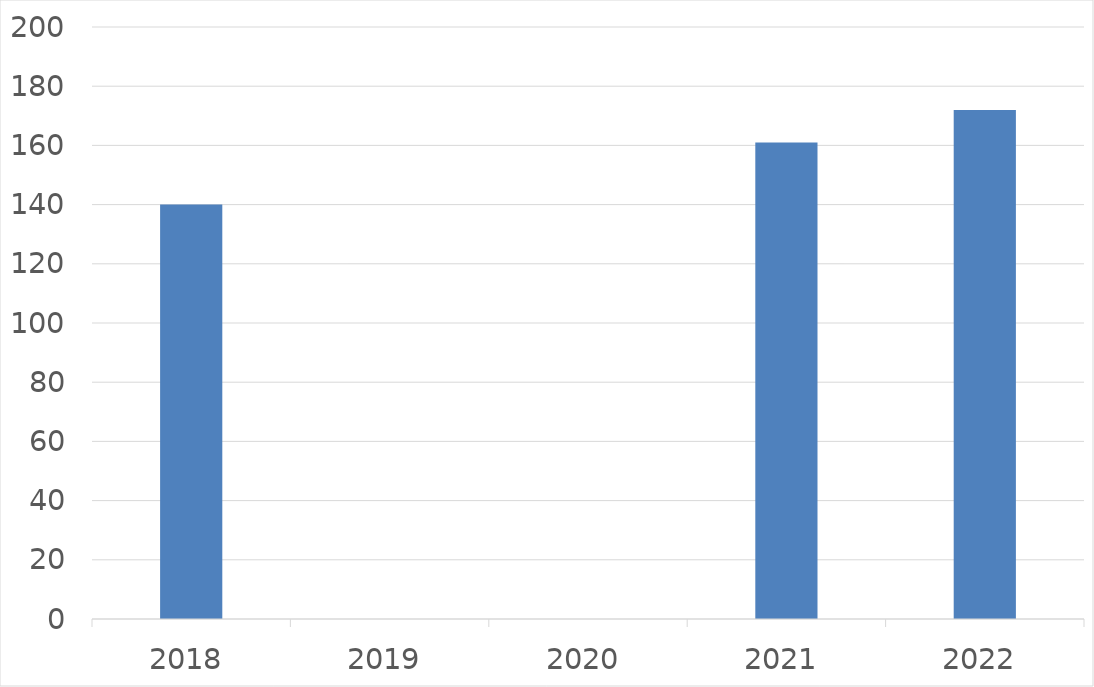
| Category | Series 0 |
|---|---|
| 2018 | 140 |
| 2019 | 0 |
| 2020 | 0 |
| 2021 | 161 |
| 2022 | 172 |